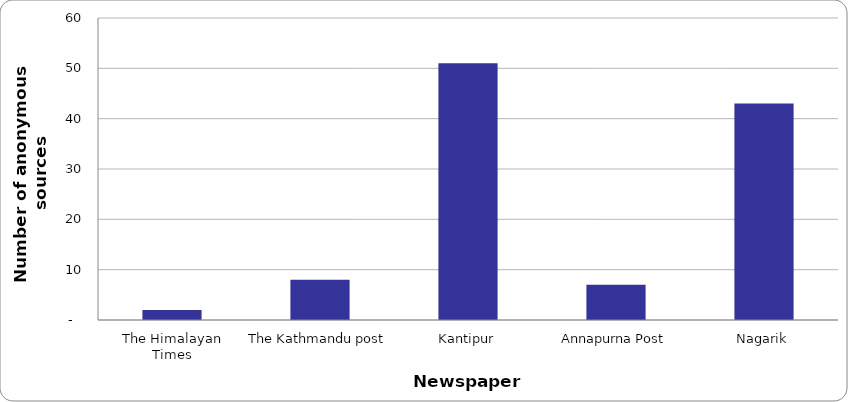
| Category | Corruption |
|---|---|
| The Himalayan Times | 2 |
| The Kathmandu post | 8 |
| Kantipur | 51 |
| Annapurna Post | 7 |
| Nagarik | 43 |